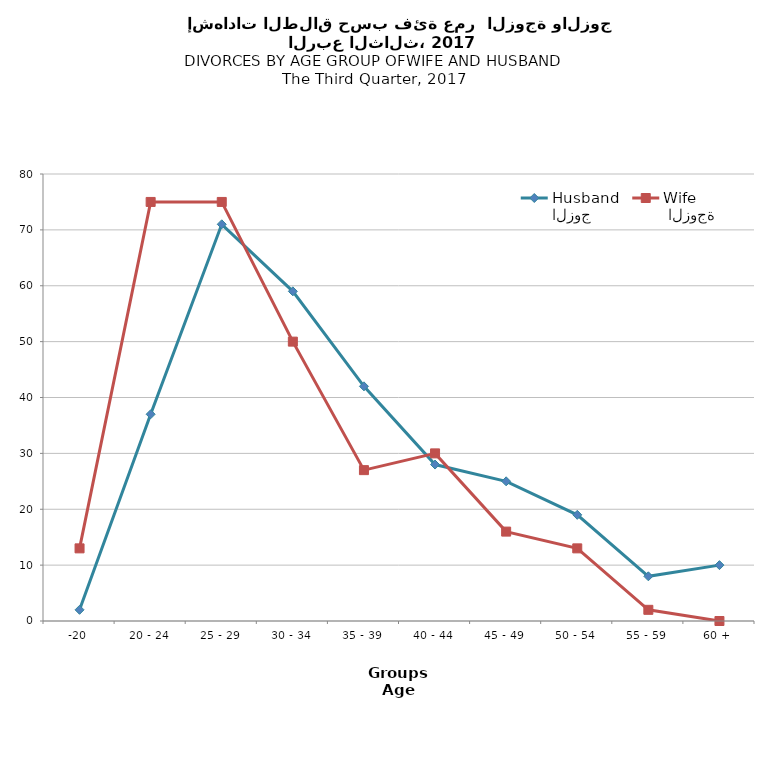
| Category | الزوج
Husband |  الزوجة
Wife |
|---|---|---|
| -20 | 2 | 13 |
| 20 - 24 | 37 | 75 |
| 25 - 29 | 71 | 75 |
| 30 - 34 | 59 | 50 |
| 35 - 39 | 42 | 27 |
| 40 - 44 | 28 | 30 |
| 45 - 49 | 25 | 16 |
| 50 - 54 | 19 | 13 |
| 55 - 59 | 8 | 2 |
| 60 + | 10 | 0 |